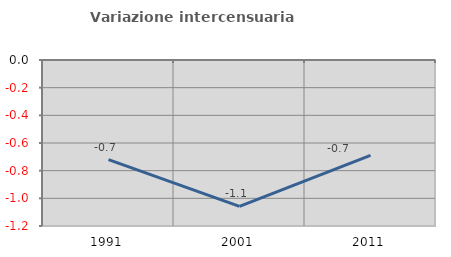
| Category | Variazione intercensuaria annua |
|---|---|
| 1991.0 | -0.72 |
| 2001.0 | -1.059 |
| 2011.0 | -0.689 |